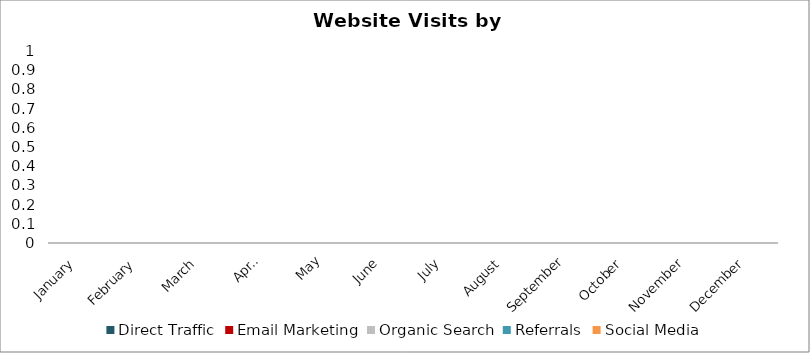
| Category | Direct Traffic | Email Marketing | Organic Search | Referrals | Social Media |
|---|---|---|---|---|---|
| January | 0 | 0 | 0 | 0 | 0 |
| February | 0 | 0 | 0 | 0 | 0 |
| March | 0 | 0 | 0 | 0 | 0 |
| April | 0 | 0 | 0 | 0 | 0 |
| May | 0 | 0 | 0 | 0 | 0 |
| June | 0 | 0 | 0 | 0 | 0 |
| July | 0 | 0 | 0 | 0 | 0 |
| August | 0 | 0 | 0 | 0 | 0 |
| September | 0 | 0 | 0 | 0 | 0 |
| October | 0 | 0 | 0 | 0 | 0 |
| November | 0 | 0 | 0 | 0 | 0 |
| December | 0 | 0 | 0 | 0 | 0 |